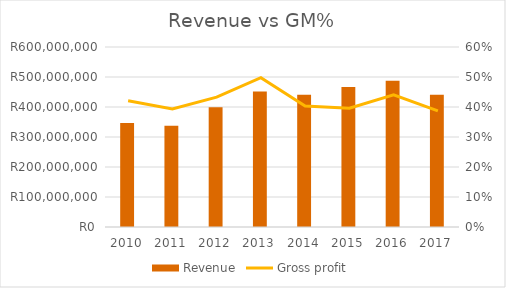
| Category | Revenue |
|---|---|
| 2010.0 | 346795197 |
| 2011.0 | 337160039 |
| 2012.0 | 398970138 |
| 2013.0 | 451853632 |
| 2014.0 | 441055541 |
| 2015.0 | 466653371 |
| 2016.0 | 487203247 |
| 2017.0 | 441222016 |